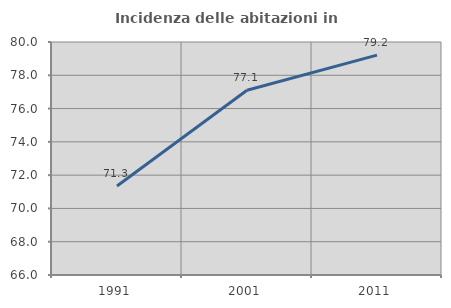
| Category | Incidenza delle abitazioni in proprietà  |
|---|---|
| 1991.0 | 71.343 |
| 2001.0 | 77.104 |
| 2011.0 | 79.209 |